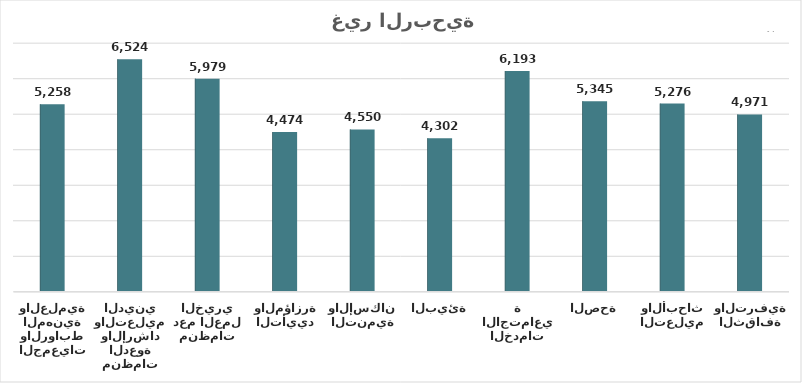
| Category | Series 0 |
|---|---|
| الثقافة والترفية | 4970.753 |
| التعليم والأبحاث | 5275.776 |
| الصحة | 5344.812 |
| الخدمات الاجتماعية | 6192.773 |
| البيئة | 4301.506 |
| التنمية والإسكان | 4549.672 |
| التأييد والمؤازرة | 4474.269 |
| منظمات دعم العمل الخيري | 5978.516 |
| منظمات الدعوة والإرشاد والتعليم الديني | 6524.193 |
| الجمعيات والروابط المهنية والعلمية | 5257.761 |